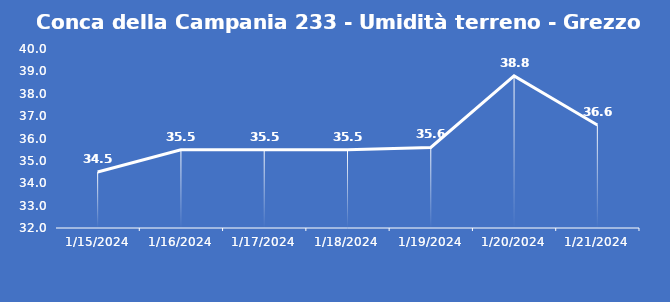
| Category | Conca della Campania 233 - Umidità terreno - Grezzo (%VWC) |
|---|---|
| 1/15/24 | 34.5 |
| 1/16/24 | 35.5 |
| 1/17/24 | 35.5 |
| 1/18/24 | 35.5 |
| 1/19/24 | 35.6 |
| 1/20/24 | 38.8 |
| 1/21/24 | 36.6 |